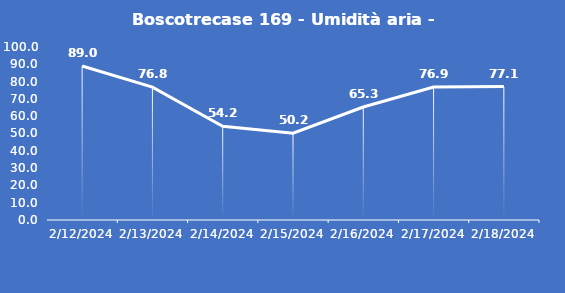
| Category | Boscotrecase 169 - Umidità aria - Grezzo (%) |
|---|---|
| 2/12/24 | 89 |
| 2/13/24 | 76.8 |
| 2/14/24 | 54.2 |
| 2/15/24 | 50.2 |
| 2/16/24 | 65.3 |
| 2/17/24 | 76.9 |
| 2/18/24 | 77.1 |